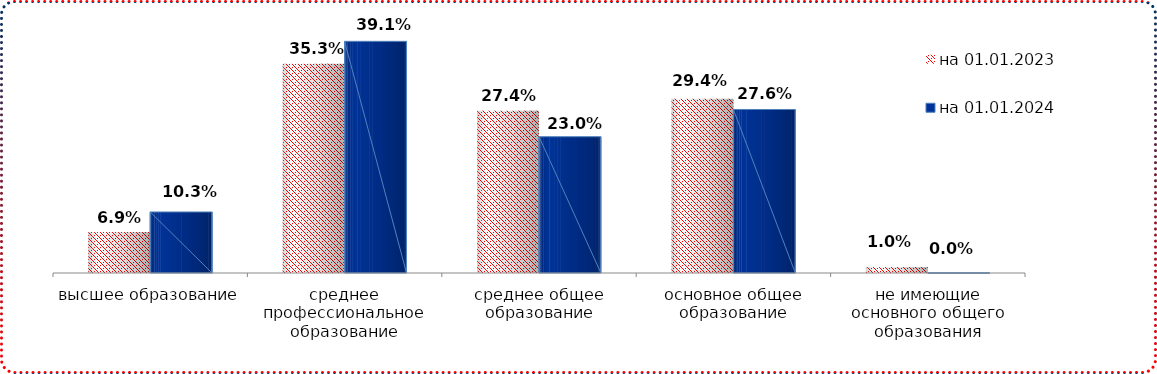
| Category | на 01.01.2023 | на 01.01.2024 |
|---|---|---|
| высшее образование | 0.069 | 0.103 |
| среднее профессиональное образование | 0.353 | 0.391 |
| среднее общее образование | 0.274 | 0.23 |
| основное общее образование | 0.294 | 0.276 |
| не имеющие основного общего образования | 0.01 | 0 |